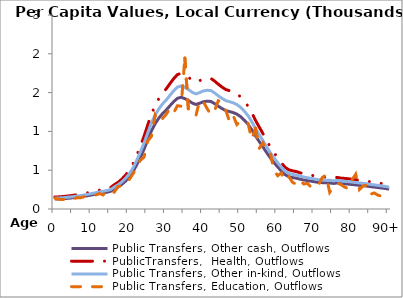
| Category | Public Transfers, Other cash, Outflows | PublicTransfers,  Health, Outflows | Public Transfers, Other in-kind, Outflows | Public Transfers, Education, Outflows |
|---|---|---|---|---|
| 0 | 127.868 | 155.241 | 140.818 | 139.372 |
|  | 128.766 | 156.331 | 141.807 | 125.386 |
| 2 | 131.651 | 159.834 | 144.984 | 122.834 |
| 3 | 135.623 | 164.656 | 149.359 | 125.546 |
| 4 | 140.3 | 170.335 | 154.51 | 115.521 |
| 5 | 145.709 | 176.902 | 160.467 | 128.988 |
| 6 | 151.315 | 183.707 | 166.64 | 146.42 |
| 7 | 157.697 | 191.455 | 173.668 | 146.355 |
| 8 | 165.046 | 200.377 | 181.761 | 159.665 |
| 9 | 173.075 | 210.126 | 190.604 | 165.657 |
| 10 | 181.746 | 220.653 | 200.153 | 169.334 |
| 11 | 190.55 | 231.342 | 209.849 | 180.892 |
| 12 | 199.102 | 241.724 | 219.267 | 199.182 |
| 13 | 207.594 | 252.035 | 228.619 | 181.379 |
| 14 | 216.137 | 262.406 | 238.027 | 240.716 |
| 15 | 228.101 | 276.931 | 251.203 | 218.349 |
| 16 | 257.606 | 312.753 | 283.696 | 217.028 |
| 17 | 282.646 | 343.153 | 311.272 | 290.084 |
| 18 | 315.937 | 383.571 | 347.935 | 294.54 |
| 19 | 357.38 | 433.885 | 393.574 | 327.5 |
| 20 | 409.921 | 497.673 | 451.437 | 379.043 |
| 21 | 477.018 | 579.135 | 525.33 | 451.762 |
| 22 | 566.418 | 687.673 | 623.784 | 528.728 |
| 23 | 664.165 | 806.344 | 731.43 | 627.588 |
| 24 | 769.532 | 934.267 | 847.469 | 668.019 |
| 25 | 890.543 | 1081.183 | 980.736 | 874.624 |
| 26 | 1006.773 | 1222.295 | 1108.737 | 937.421 |
| 27 | 1099.477 | 1334.844 | 1210.83 | 1209.676 |
| 28 | 1171.84 | 1422.698 | 1290.522 | 1122.429 |
| 29 | 1230.28 | 1493.648 | 1354.88 | 1167.631 |
| 30 | 1276.218 | 1549.42 | 1405.471 | 1220.681 |
| 31 | 1331.525 | 1616.568 | 1466.38 | 1301.138 |
| 32 | 1383.662 | 1679.865 | 1523.796 | 1241.673 |
| 33 | 1426.417 | 1731.773 | 1570.882 | 1330.991 |
| 34 | 1439.851 | 1748.083 | 1585.676 | 1324.592 |
| 35 | 1422.031 | 1726.448 | 1566.052 | 1945.607 |
| 36 | 1397.16 | 1696.252 | 1538.661 | 1251.129 |
| 37 | 1364.948 | 1657.145 | 1503.187 | 1210.394 |
| 38 | 1346.947 | 1635.29 | 1483.363 | 1207.253 |
| 39 | 1362.62 | 1654.318 | 1500.623 | 1403.271 |
| 40 | 1382.505 | 1678.46 | 1522.522 | 1381.145 |
| 41 | 1388.968 | 1686.307 | 1529.64 | 1294.22 |
| 42 | 1386.003 | 1682.708 | 1526.375 | 1215.295 |
| 43 | 1358.23 | 1648.989 | 1495.789 | 1267.935 |
| 44 | 1324.565 | 1608.118 | 1458.715 | 1395.799 |
| 45 | 1294.515 | 1571.634 | 1425.621 | 1371.31 |
| 46 | 1268.202 | 1539.689 | 1396.644 | 1276.692 |
| 47 | 1256.079 | 1524.97 | 1383.292 | 1129.35 |
| 48 | 1242.406 | 1508.37 | 1368.234 | 1206.057 |
| 49 | 1222.575 | 1484.295 | 1346.396 | 1088.541 |
| 50 | 1190.258 | 1445.059 | 1310.805 | 1134.89 |
| 51 | 1144.957 | 1390.06 | 1260.916 | 1105.247 |
| 52 | 1092.27 | 1326.095 | 1202.893 | 1105.603 |
| 53 | 1023.593 | 1242.715 | 1127.26 | 897.095 |
| 54 | 943.099 | 1144.99 | 1038.614 | 1040.915 |
| 55 | 871.255 | 1057.766 | 959.494 | 778.62 |
| 56 | 802.152 | 973.87 | 883.392 | 852.012 |
| 57 | 728.837 | 884.86 | 802.652 | 745.434 |
| 58 | 659.165 | 800.273 | 725.924 | 723.641 |
| 59 | 598.107 | 726.144 | 658.682 | 495.303 |
| 60 | 542.603 | 658.76 | 597.557 | 428.958 |
| 61 | 487.787 | 592.208 | 537.189 | 464.452 |
| 62 | 442.62 | 537.373 | 487.448 | 360.163 |
| 63 | 415.723 | 504.718 | 457.827 | 415.397 |
| 64 | 404.992 | 491.689 | 446.009 | 344.295 |
| 65 | 397.135 | 482.151 | 437.356 | 316.614 |
| 66 | 384.22 | 466.471 | 423.133 | 373.267 |
| 67 | 374.169 | 454.269 | 412.065 | 321.736 |
| 68 | 366.142 | 444.522 | 403.224 | 330.91 |
| 69 | 358.379 | 435.098 | 394.675 | 280.78 |
| 70 | 350.373 | 425.378 | 385.858 | 321.266 |
| 71 | 343.026 | 416.458 | 377.767 | 311.207 |
| 72 | 339.934 | 412.704 | 374.362 | 405.595 |
| 73 | 337.375 | 409.597 | 371.544 | 438.629 |
| 74 | 335.537 | 407.366 | 369.52 | 215.136 |
| 75 | 329.249 | 399.732 | 362.595 | 284.381 |
| 76 | 335.449 | 407.259 | 369.423 | 333.202 |
| 77 | 328.084 | 398.318 | 361.312 | 316.161 |
| 78 | 324.692 | 394.2 | 357.577 | 282.575 |
| 79 | 320.644 | 389.285 | 353.118 | 263.387 |
| 80 | 315.809 | 383.414 | 347.793 | 375.189 |
| 81 | 310.759 | 377.284 | 342.232 | 448.221 |
| 82 | 305.272 | 370.622 | 336.189 | 250.209 |
| 83 | 299.502 | 363.617 | 329.835 | 297.938 |
| 84 | 295.42 | 358.661 | 325.339 | 306.113 |
| 85 | 287.988 | 349.638 | 317.155 | 190.785 |
| 86 | 282.292 | 342.723 | 310.882 | 207.024 |
| 87 | 276.395 | 335.563 | 304.387 | 177.633 |
| 88 | 270.217 | 328.063 | 297.584 | 166.608 |
| 89 | 264.366 | 320.96 | 291.141 | 197.64 |
| 90+ | 255.997 | 310.799 | 281.924 | 189.107 |